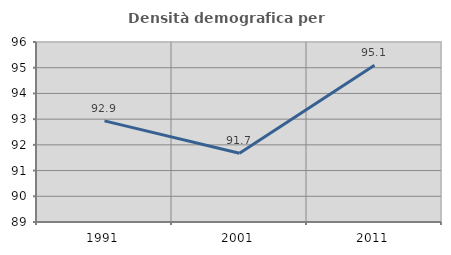
| Category | Densità demografica |
|---|---|
| 1991.0 | 92.931 |
| 2001.0 | 91.67 |
| 2011.0 | 95.092 |